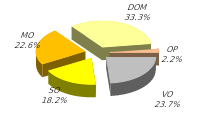
| Category | Series 0 |
|---|---|
| VO | 30888.293 |
| SO | 23769.854 |
| MO | 29505.08 |
| DOM | 43493.924 |
| OP | 2864.165 |